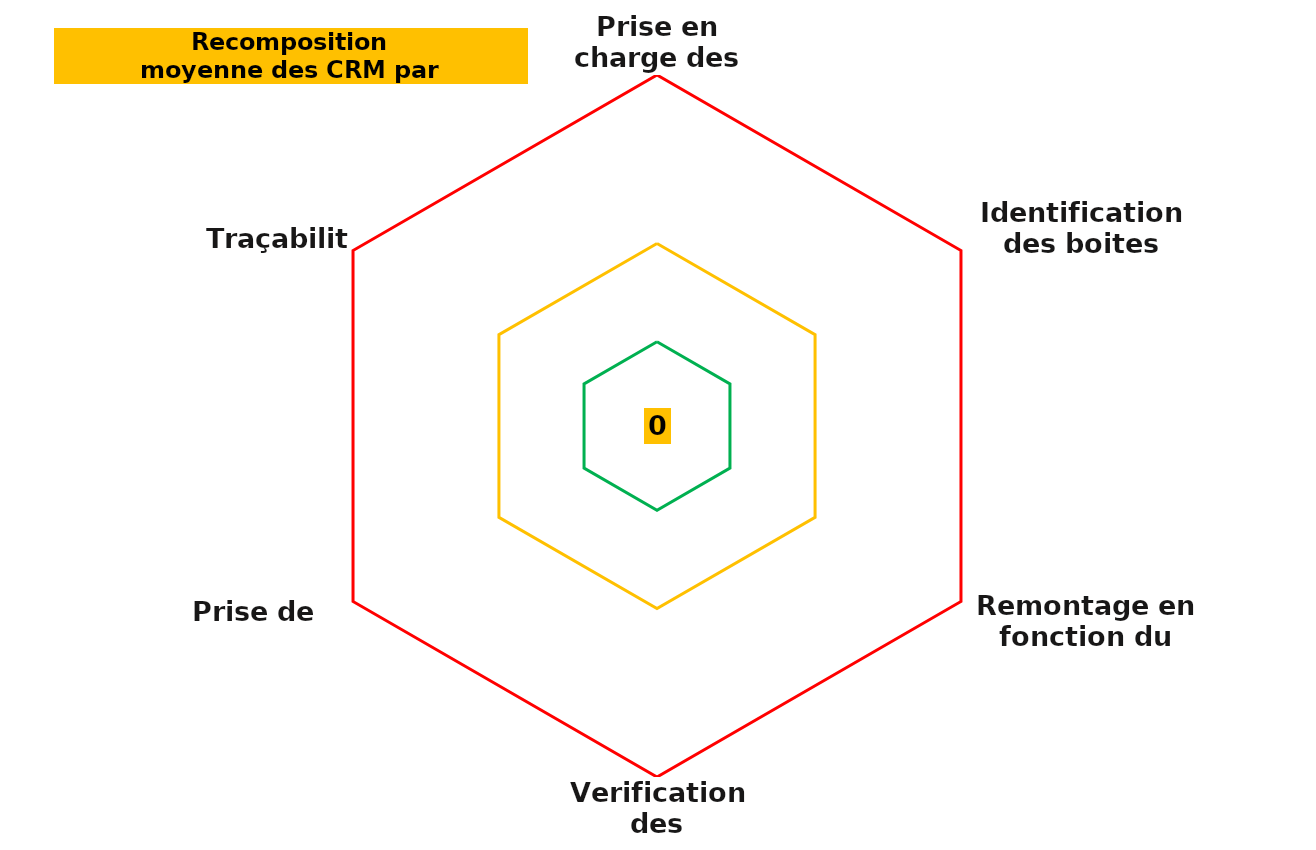
| Category | Series 0 | Series 1 | Series 2 | Series 3 |
|---|---|---|---|---|
| Prise en charge des embases | 0 | 6 | 13 | 25 |
| Identification des boites | 0 | 6 | 13 | 25 |
| Remontage en fonction du listing | 0 | 6 | 13 | 25 |
| Verification des instruments | 0 | 6 | 13 | 25 |
| Prise de poste | 0 | 6 | 13 | 25 |
| Traçabilité | 0 | 6 | 13 | 25 |